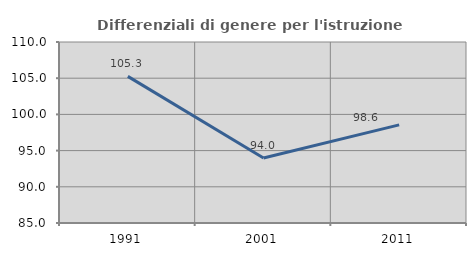
| Category | Differenziali di genere per l'istruzione superiore |
|---|---|
| 1991.0 | 105.257 |
| 2001.0 | 93.988 |
| 2011.0 | 98.555 |